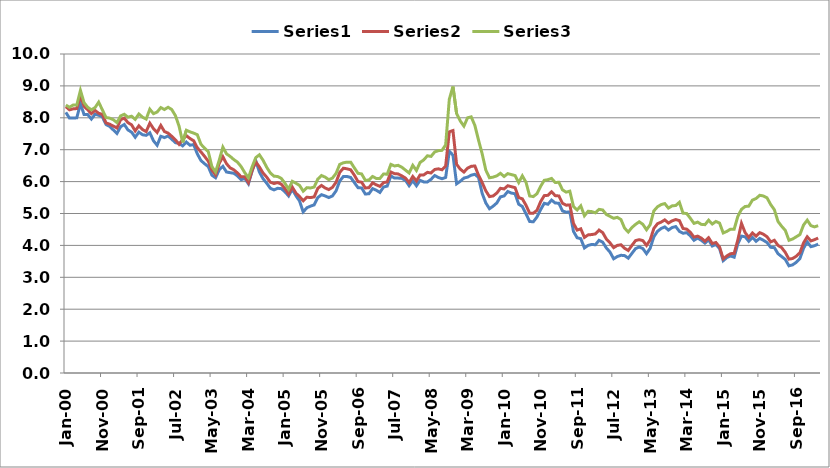
| Category | Series 0 | Series 1 | Series 2 |
|---|---|---|---|
| 2000-01-01 | 8.17 | 8.35 | 8.4 |
| 2000-02-01 | 7.99 | 8.25 | 8.33 |
| 2000-03-01 | 7.99 | 8.28 | 8.4 |
| 2000-04-01 | 8 | 8.29 | 8.4 |
| 2000-05-01 | 8.44 | 8.7 | 8.86 |
| 2000-06-01 | 8.1 | 8.36 | 8.47 |
| 2000-07-01 | 8.1 | 8.25 | 8.33 |
| 2000-08-01 | 7.96 | 8.13 | 8.25 |
| 2000-09-01 | 8.11 | 8.23 | 8.32 |
| 2000-10-01 | 8.08 | 8.14 | 8.49 |
| 2000-11-01 | 8.03 | 8.11 | 8.25 |
| 2000-12-01 | 7.79 | 7.84 | 8.01 |
| 2001-01-01 | 7.73 | 7.8 | 7.99 |
| 2001-02-01 | 7.62 | 7.74 | 7.94 |
| 2001-03-01 | 7.51 | 7.68 | 7.85 |
| 2001-04-01 | 7.72 | 7.94 | 8.06 |
| 2001-05-01 | 7.79 | 7.99 | 8.11 |
| 2001-06-01 | 7.62 | 7.85 | 8.02 |
| 2001-07-01 | 7.55 | 7.78 | 8.05 |
| 2001-08-01 | 7.39 | 7.59 | 7.95 |
| 2001-09-01 | 7.55 | 7.75 | 8.12 |
| 2001-10-01 | 7.47 | 7.63 | 8.02 |
| 2001-11-01 | 7.45 | 7.57 | 7.96 |
| 2001-12-01 | 7.53 | 7.83 | 8.27 |
| 2002-01-01 | 7.28 | 7.66 | 8.13 |
| 2002-02-01 | 7.14 | 7.54 | 8.18 |
| 2002-03-01 | 7.42 | 7.76 | 8.32 |
| 2002-04-01 | 7.38 | 7.57 | 8.26 |
| 2002-05-01 | 7.43 | 7.52 | 8.33 |
| 2002-06-01 | 7.33 | 7.42 | 8.26 |
| 2002-07-01 | 7.22 | 7.31 | 8.07 |
| 2002-08-01 | 7.2 | 7.17 | 7.74 |
| 2002-09-01 | 7.12 | 7.32 | 7.23 |
| 2002-10-01 | 7.24 | 7.44 | 7.61 |
| 2002-11-01 | 7.14 | 7.35 | 7.56 |
| 2002-12-01 | 7.16 | 7.28 | 7.52 |
| 2003-01-01 | 6.87 | 7.06 | 7.47 |
| 2003-02-01 | 6.66 | 6.93 | 7.17 |
| 2003-03-01 | 6.56 | 6.79 | 7.05 |
| 2003-04-01 | 6.47 | 6.64 | 6.94 |
| 2003-05-01 | 6.2 | 6.36 | 6.47 |
| 2003-06-01 | 6.12 | 6.21 | 6.3 |
| 2003-07-01 | 6.37 | 6.57 | 6.67 |
| 2003-08-01 | 6.48 | 6.78 | 7.08 |
| 2003-09-01 | 6.3 | 6.56 | 6.87 |
| 2003-10-01 | 6.28 | 6.43 | 6.79 |
| 2003-11-01 | 6.26 | 6.37 | 6.69 |
| 2003-12-01 | 6.18 | 6.27 | 6.61 |
| 2004-01-01 | 6.06 | 6.15 | 6.47 |
| 2004-02-01 | 6.1 | 6.15 | 6.28 |
| 2004-03-01 | 5.93 | 5.97 | 6.12 |
| 2004-04-01 | 6.33 | 6.35 | 6.46 |
| 2004-05-01 | 6.66 | 6.62 | 6.75 |
| 2004-06-01 | 6.3 | 6.46 | 6.84 |
| 2004-07-01 | 6.09 | 6.27 | 6.67 |
| 2004-08-01 | 5.95 | 6.14 | 6.45 |
| 2004-09-01 | 5.79 | 5.98 | 6.27 |
| 2004-10-01 | 5.74 | 5.94 | 6.17 |
| 2004-11-01 | 5.79 | 5.97 | 6.16 |
| 2004-12-01 | 5.78 | 5.92 | 6.1 |
| 2005-01-01 | 5.68 | 5.78 | 5.95 |
| 2005-02-01 | 5.55 | 5.61 | 5.76 |
| 2005-03-01 | 5.76 | 5.83 | 6.01 |
| 2005-04-01 | 5.56 | 5.64 | 5.95 |
| 2005-05-01 | 5.39 | 5.53 | 5.88 |
| 2005-06-01 | 5.05 | 5.4 | 5.7 |
| 2005-07-01 | 5.18 | 5.51 | 5.81 |
| 2005-08-01 | 5.23 | 5.5 | 5.8 |
| 2005-09-01 | 5.27 | 5.52 | 5.83 |
| 2005-10-01 | 5.5 | 5.79 | 6.08 |
| 2005-11-01 | 5.59 | 5.88 | 6.19 |
| 2005-12-01 | 5.55 | 5.8 | 6.14 |
| 2006-01-01 | 5.5 | 5.75 | 6.06 |
| 2006-02-01 | 5.55 | 5.82 | 6.11 |
| 2006-03-01 | 5.71 | 5.98 | 6.26 |
| 2006-04-01 | 6.02 | 6.29 | 6.54 |
| 2006-05-01 | 6.16 | 6.42 | 6.59 |
| 2006-06-01 | 6.16 | 6.4 | 6.61 |
| 2006-07-01 | 6.13 | 6.37 | 6.61 |
| 2006-08-01 | 5.97 | 6.2 | 6.43 |
| 2006-09-01 | 5.81 | 6 | 6.26 |
| 2006-10-01 | 5.8 | 5.98 | 6.24 |
| 2006-11-01 | 5.61 | 5.8 | 6.04 |
| 2006-12-01 | 5.62 | 5.81 | 6.05 |
| 2007-01-01 | 5.78 | 5.96 | 6.16 |
| 2007-02-01 | 5.73 | 5.9 | 6.1 |
| 2007-03-01 | 5.66 | 5.85 | 6.1 |
| 2007-04-01 | 5.83 | 5.97 | 6.24 |
| 2007-05-01 | 5.86 | 5.99 | 6.23 |
| 2007-06-01 | 6.18 | 6.3 | 6.54 |
| 2007-07-01 | 6.11 | 6.25 | 6.49 |
| 2007-08-01 | 6.11 | 6.24 | 6.51 |
| 2007-09-01 | 6.1 | 6.18 | 6.45 |
| 2007-10-01 | 6.04 | 6.11 | 6.36 |
| 2007-11-01 | 5.87 | 5.97 | 6.27 |
| 2007-12-01 | 6.03 | 6.16 | 6.51 |
| 2008-01-01 | 5.87 | 6.02 | 6.35 |
| 2008-02-01 | 6.04 | 6.21 | 6.6 |
| 2008-03-01 | 5.99 | 6.21 | 6.68 |
| 2008-04-01 | 5.99 | 6.29 | 6.81 |
| 2008-05-01 | 6.07 | 6.27 | 6.79 |
| 2008-06-01 | 6.19 | 6.38 | 6.93 |
| 2008-07-01 | 6.13 | 6.4 | 6.97 |
| 2008-08-01 | 6.09 | 6.37 | 6.98 |
| 2008-09-01 | 6.13 | 6.49 | 7.15 |
| 2008-10-01 | 6.95 | 7.56 | 8.58 |
| 2008-11-01 | 6.83 | 7.6 | 8.98 |
| 2008-12-01 | 5.93 | 6.54 | 8.13 |
| 2009-01-01 | 6.01 | 6.39 | 7.9 |
| 2009-02-01 | 6.11 | 6.3 | 7.74 |
| 2009-03-01 | 6.14 | 6.42 | 8 |
| 2009-04-01 | 6.2 | 6.48 | 8.03 |
| 2009-05-01 | 6.23 | 6.49 | 7.76 |
| 2009-06-01 | 6.13 | 6.2 | 7.3 |
| 2009-07-01 | 5.63 | 5.97 | 6.87 |
| 2009-08-01 | 5.33 | 5.71 | 6.36 |
| 2009-09-01 | 5.15 | 5.53 | 6.12 |
| 2009-10-01 | 5.23 | 5.55 | 6.14 |
| 2009-11-01 | 5.33 | 5.64 | 6.18 |
| 2009-12-01 | 5.52 | 5.79 | 6.26 |
| 2010-01-01 | 5.55 | 5.77 | 6.16 |
| 2010-02-01 | 5.69 | 5.87 | 6.25 |
| 2010-03-01 | 5.64 | 5.84 | 6.22 |
| 2010-04-01 | 5.62 | 5.81 | 6.19 |
| 2010-05-01 | 5.29 | 5.5 | 5.97 |
| 2010-06-01 | 5.22 | 5.46 | 6.18 |
| 2010-07-01 | 4.99 | 5.26 | 5.98 |
| 2010-08-01 | 4.75 | 5.01 | 5.55 |
| 2010-09-01 | 4.74 | 5.01 | 5.53 |
| 2010-10-01 | 4.89 | 5.1 | 5.62 |
| 2010-11-01 | 5.12 | 5.37 | 5.85 |
| 2010-12-01 | 5.32 | 5.56 | 6.04 |
| 2011-01-01 | 5.29 | 5.57 | 6.06 |
| 2011-02-01 | 5.42 | 5.68 | 6.1 |
| 2011-03-01 | 5.33 | 5.56 | 5.97 |
| 2011-04-01 | 5.32 | 5.55 | 5.98 |
| 2011-05-01 | 5.08 | 5.32 | 5.74 |
| 2011-06-01 | 5.04 | 5.26 | 5.67 |
| 2011-07-01 | 5.05 | 5.27 | 5.7 |
| 2011-08-01 | 4.44 | 4.69 | 5.22 |
| 2011-09-01 | 4.24 | 4.48 | 5.11 |
| 2011-10-01 | 4.21 | 4.52 | 5.24 |
| 2011-11-01 | 3.92 | 4.25 | 4.93 |
| 2011-12-01 | 4 | 4.33 | 5.07 |
| 2012-01-01 | 4.03 | 4.34 | 5.06 |
| 2012-02-01 | 4.02 | 4.36 | 5.02 |
| 2012-03-01 | 4.16 | 4.48 | 5.13 |
| 2012-04-01 | 4.1 | 4.4 | 5.11 |
| 2012-05-01 | 3.92 | 4.2 | 4.97 |
| 2012-06-01 | 3.79 | 4.08 | 4.91 |
| 2012-07-01 | 3.58 | 3.93 | 4.85 |
| 2012-08-01 | 3.65 | 4 | 4.88 |
| 2012-09-01 | 3.69 | 4.02 | 4.81 |
| 2012-10-01 | 3.68 | 3.91 | 4.54 |
| 2012-11-01 | 3.6 | 3.84 | 4.42 |
| 2012-12-01 | 3.75 | 4 | 4.56 |
| 2013-01-01 | 3.9 | 4.15 | 4.66 |
| 2013-02-01 | 3.95 | 4.18 | 4.74 |
| 2013-03-01 | 3.9 | 4.15 | 4.66 |
| 2013-04-01 | 3.74 | 4 | 4.49 |
| 2013-05-01 | 3.91 | 4.17 | 4.65 |
| 2013-06-01 | 4.27 | 4.53 | 5.08 |
| 2013-07-01 | 4.44 | 4.68 | 5.21 |
| 2013-08-01 | 4.53 | 4.73 | 5.28 |
| 2013-09-01 | 4.58 | 4.8 | 5.31 |
| 2013-10-01 | 4.48 | 4.7 | 5.17 |
| 2013-11-01 | 4.56 | 4.77 | 5.24 |
| 2013-12-01 | 4.59 | 4.81 | 5.25 |
| 2014-01-01 | 4.44 | 4.778 | 5.351 |
| 2014-02-01 | 4.38 | 4.53 | 5.01 |
| 2014-03-01 | 4.4 | 4.51 | 5 |
| 2014-04-01 | 4.3 | 4.41 | 4.85 |
| 2014-05-01 | 4.16 | 4.26 | 4.69 |
| 2014-06-01 | 4.23 | 4.29 | 4.73 |
| 2014-07-01 | 4.16 | 4.23 | 4.66 |
| 2014-08-01 | 4.07 | 4.13 | 4.65 |
| 2014-09-01 | 4.18 | 4.24 | 4.79 |
| 2014-10-01 | 3.98 | 4.06 | 4.67 |
| 2014-11-01 | 4.03 | 4.09 | 4.75 |
| 2014-12-01 | 3.9 | 3.95 | 4.7 |
| 2015-01-01 | 3.52 | 3.58 | 4.39 |
| 2015-02-01 | 3.62 | 3.67 | 4.44 |
| 2015-03-01 | 3.67 | 3.74 | 4.51 |
| 2015-04-01 | 3.63 | 3.75 | 4.51 |
| 2015-05-01 | 4.05 | 4.17 | 4.91 |
| 2015-06-01 | 4.29 | 4.69 | 5.13 |
| 2015-07-01 | 4.27 | 4.4 | 5.22 |
| 2015-08-01 | 4.13 | 4.25 | 5.23 |
| 2015-09-01 | 4.25 | 4.39 | 5.42 |
| 2015-10-01 | 4.13 | 4.29 | 5.47 |
| 2015-11-01 | 4.22 | 4.4 | 5.57 |
| 2015-12-01 | 4.16 | 4.35 | 5.55 |
| 2016-01-01 | 4.09 | 4.27 | 5.49 |
| 2016-02-01 | 3.94 | 4.11 | 5.28 |
| 2016-03-01 | 3.93 | 4.16 | 5.12 |
| 2016-04-01 | 3.74 | 4 | 4.75 |
| 2016-05-01 | 3.65 | 3.93 | 4.6 |
| 2016-06-01 | 3.56 | 3.78 | 4.47 |
| 2016-07-01 | 3.36 | 3.57 | 4.16 |
| 2016-08-01 | 3.39 | 3.59 | 4.2 |
| 2016-09-01 | 3.47 | 3.66 | 4.27 |
| 2016-10-01 | 3.59 | 3.77 | 4.34 |
| 2016-11-01 | 3.91 | 4.08 | 4.64 |
| 2016-12-01 | 4.11 | 4.27 | 4.79 |
| 2017-01-01 | 3.96 | 4.14 | 4.62 |
| 2017-02-01 | 3.99 | 4.18 | 4.58 |
| 2017-03-01 | 4.04 | 4.23 | 4.62 |